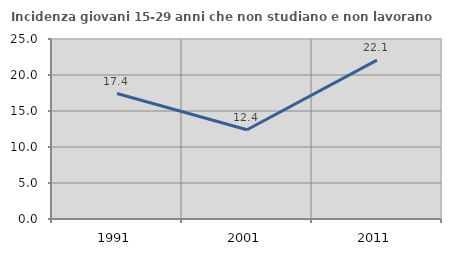
| Category | Incidenza giovani 15-29 anni che non studiano e non lavorano  |
|---|---|
| 1991.0 | 17.43 |
| 2001.0 | 12.393 |
| 2011.0 | 22.059 |